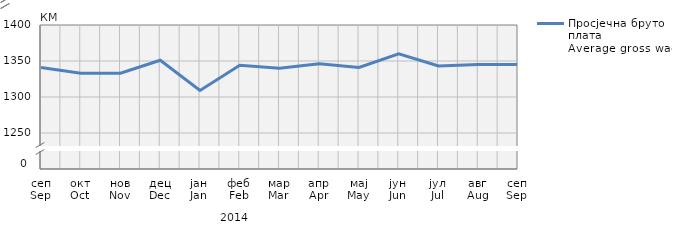
| Category | Просјечна бруто плата
Average gross wage |
|---|---|
| сеп
Sep | 1341 |
| окт
Oct | 1333 |
| нов
Nov | 1333 |
| дец
Dec | 1351 |
| јан
Jan | 1309 |
| феб
Feb | 1344 |
| мар
Mar | 1340 |
| апр
Apr | 1346 |
| мај
May | 1341 |
| јун
Jun | 1360 |
| јул
Jul | 1343 |
| авг
Aug | 1345 |
| сеп
Sep | 1345 |